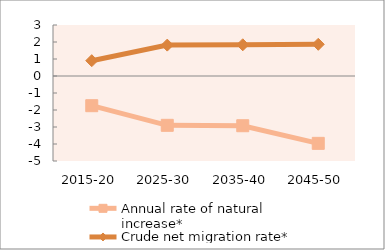
| Category | Annual rate of natural increase* | Crude net migration rate* |
|---|---|---|
| 2015-20 | -1.747 | 0.901 |
| 2025-30 | -2.901 | 1.817 |
| 2035-40 | -2.925 | 1.837 |
| 2045-50 | -3.962 | 1.865 |